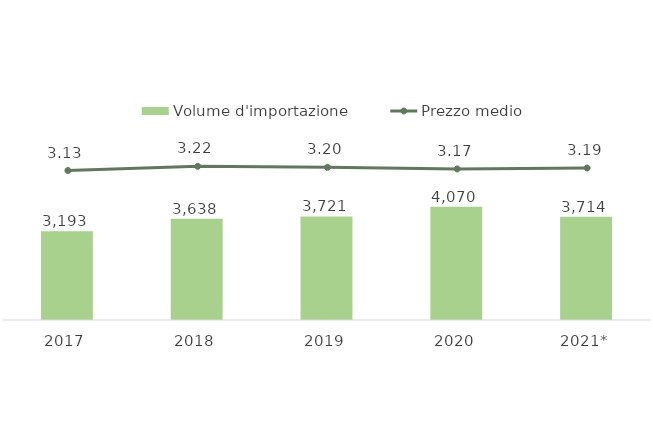
| Category | Volume d'importazione |
|---|---|
| 2017 | 3193.065 |
| 2018 | 3638.43 |
| 2019 | 3720.575 |
| 2020 | 4069.614 |
| 2021* | 3713.831 |